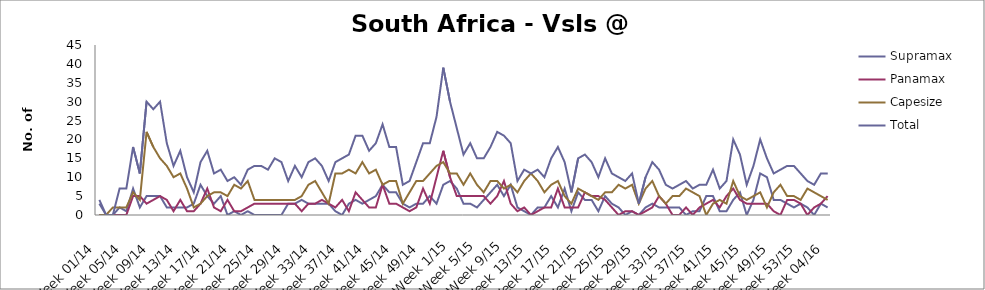
| Category | Supramax | Panamax | Capesize | Total |
|---|---|---|---|---|
| Week 01/14 | 3 | 0 | 0 | 4 |
| Week 02/14 | 0 | 0 | 0 | 0 |
| Week 03/14 | 0 | 0 | 2 | 0 |
| Week 04/14 | 2 | 0 | 2 | 7 |
| Week 05/14 | 1 | 0 | 2 | 7 |
| Week 06/14 | 7 | 5 | 6 | 18 |
| Week 07/14 | 2 | 5 | 4 | 11 |
| Week 08/14 | 5 | 3 | 22 | 30 |
| Week 09/14 | 5 | 4 | 18 | 28 |
| Week 10/14 | 5 | 5 | 15 | 30 |
| Week 11/14 | 2 | 4 | 13 | 19 |
| Week 12/14 | 2 | 1 | 10 | 13 |
| Week 13/14 | 2 | 4 | 11 | 17 |
| Week 14/14 | 2 | 1 | 7 | 10 |
| Week 15/14 | 3 | 1 | 2 | 6 |
| Week 16/14 | 8 | 3 | 3 | 14 |
| Week 17/14 | 5 | 7 | 5 | 17 |
| Week 18/14 | 3 | 2 | 6 | 11 |
| Week 19/14 | 5 | 1 | 6 | 12 |
| Week 20/14 | 0 | 4 | 5 | 9 |
| Week 21/14 | 1 | 1 | 8 | 10 |
| Week 22/14 | 0 | 1 | 7 | 8 |
| Week 23/14 | 1 | 2 | 9 | 12 |
| Week 24/14 | 0 | 3 | 4 | 13 |
| Week 25/14 | 0 | 3 | 4 | 13 |
| Week 26/14 | 0 | 3 | 4 | 12 |
| Week 27/14 | 0 | 3 | 4 | 15 |
| Week 28/14 | 0 | 3 | 4 | 14 |
| Week 29/14 | 3 | 3 | 4 | 9 |
| Week 30/14 | 3 | 3 | 4 | 13 |
| Week 31/14 | 4 | 1 | 5 | 10 |
| Week 32/14 | 3 | 3 | 8 | 14 |
| Week 33/14 | 3 | 3 | 9 | 15 |
| Week 34/14 | 3 | 4 | 6 | 13 |
| Week 35/14 | 3 | 3 | 3 | 9 |
| Week 36/14 | 1 | 2 | 11 | 14 |
| Week 37/14 | 0 | 4 | 11 | 15 |
| Week 38/14 | 3 | 1 | 12 | 16 |
| Week 39/14 | 4 | 6 | 11 | 21 |
| Week 40/14 | 3 | 4 | 14 | 21 |
| Week 41/14 | 4 | 2 | 11 | 17 |
| Week 42/14 | 5 | 2 | 12 | 19 |
| Week 43/14 | 8 | 8 | 8 | 24 |
| Week 44/14 | 6 | 3 | 9 | 18 |
| Week 45/14 | 6 | 3 | 9 | 18 |
| Week 46/14 | 3 | 2 | 3 | 8 |
| Week 47/14 | 2 | 1 | 6 | 9 |
| Week 48/14 | 3 | 2 | 9 | 14 |
| Week 49/14 | 3 | 7 | 9 | 19 |
| Week 50/14 | 5 | 3 | 11 | 19 |
| Week 51/14 | 3 | 10 | 13 | 26 |
| Week 52/14 | 8 | 17 | 14 | 39 |
| Week 1/15 | 9 | 10 | 11 | 30 |
| Week 2/15 | 7 | 5 | 11 | 23 |
| Week 3/15 | 3 | 5 | 8 | 16 |
| Week 4/15 | 3 | 5 | 11 | 19 |
| Week 5/15 | 2 | 5 | 8 | 15 |
| Week 6/15 | 4 | 5 | 6 | 15 |
| Week 7/15 | 6 | 3 | 9 | 18 |
| Week 8/15 | 8 | 5 | 9 | 22 |
| Week 9/15 | 5 | 9 | 7 | 21 |
| Week 10/15 | 8 | 3 | 8 | 19 |
| Week 11/15 | 2 | 1 | 6 | 9 |
| Week 12/15 | 1 | 2 | 9 | 12 |
| Week 13/15 | 0 | 0 | 11 | 11 |
| Week 14/15 | 2 | 1 | 9 | 12 |
| Week 15/15 | 2 | 2 | 6 | 10 |
| Week 16/15 | 5 | 2 | 8 | 15 |
| Week 17/15 | 2 | 7 | 9 | 18 |
| Week 18/15 | 7 | 2 | 5 | 14 |
| Week 19/15 | 1 | 2 | 3 | 6 |
| Week 20/15 | 6 | 2 | 7 | 15 |
| Week 21/15 | 4 | 6 | 6 | 16 |
| Week 22/15 | 4 | 5 | 5 | 14 |
| Week 23/15 | 1 | 5 | 4 | 10 |
| Week 24/15 | 5 | 4 | 6 | 15 |
| Week 25/15 | 3 | 2 | 6 | 11 |
| Week 26/15 | 2 | 0 | 8 | 10 |
| Week 27/15 | 0 | 1 | 7 | 9 |
| Week 28/15 | 1 | 1 | 8 | 11 |
| Week 29/15 | 0 | 0 | 3 | 3 |
| Week 30/15 | 2 | 1 | 7 | 10 |
| Week 31/15 | 3 | 2 | 9 | 14 |
| Week 32/15 | 2 | 5 | 5 | 12 |
| Week 33/15 | 2 | 3 | 3 | 8 |
| Week 34/15 | 2 | 0 | 5 | 7 |
| Week 35/15 | 2 | 0 | 5 | 8 |
| Week 36/15 | 0 | 2 | 7 | 9 |
| Week 37/15 | 1 | 0 | 6 | 7 |
| Week 38/15 | 1 | 2 | 5 | 8 |
| Week 39/15 | 5 | 3 | 0 | 8 |
| Week 40/15 | 5 | 4 | 3 | 12 |
| Week 41/15 | 1 | 2 | 4 | 7 |
| Week 42/15 | 1 | 5 | 3 | 9 |
| Week 43/15 | 4 | 7 | 9 | 20 |
| Week 44/15 | 6 | 4 | 5 | 16 |
| Week 45/15 | 0 | 3 | 4 | 8 |
| Week 46/15 | 4 | 3 | 5 | 13 |
| Week 47/15 | 11 | 3 | 6 | 20 |
| Week 48/15 | 10 | 3 | 2 | 15 |
| Week 49/15 | 4 | 1 | 6 | 11 |
| Week 50/15 | 4 | 0 | 8 | 12 |
| Week 51/15 | 3 | 4 | 5 | 13 |
| Week 52/15 | 2 | 4 | 5 | 13 |
| Week 53/15 | 3 | 3 | 4 | 11 |
| Week 01/16 | 2 | 0 | 7 | 9 |
| Week 02/16 | 0 | 2 | 6 | 8 |
| Week 03/16 | 3 | 3 | 5 | 11 |
| Week 04/16 | 2 | 5 | 4 | 11 |